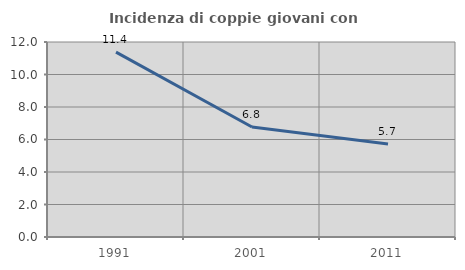
| Category | Incidenza di coppie giovani con figli |
|---|---|
| 1991.0 | 11.373 |
| 2001.0 | 6.772 |
| 2011.0 | 5.725 |